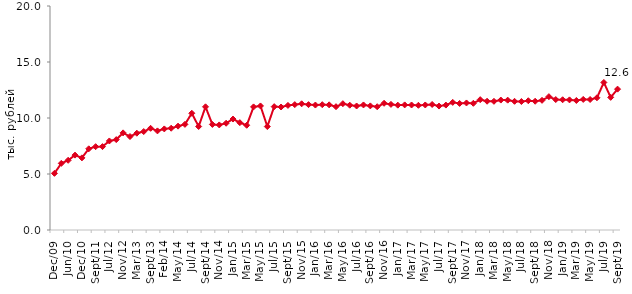
| Category | медианное значение среднедушевого располагаемого дохода, тыс. руб. |
|---|---|
| 2009-12-01 | 5.058 |
| 2010-04-01 | 5.949 |
| 2010-06-01 | 6.224 |
| 2010-09-01 | 6.686 |
| 2010-12-01 | 6.44 |
| 2011-07-01 | 7.25 |
| 2011-09-01 | 7.441 |
| 2011-12-01 | 7.446 |
| 2012-07-01 | 7.95 |
| 2012-09-01 | 8.071 |
| 2012-11-01 | 8.673 |
| 2012-12-01 | 8.345 |
| 2013-03-01 | 8.644 |
| 2013-06-01 | 8.789 |
| 2013-09-01 | 9.079 |
| 2013-12-01 | 8.849 |
| 2014-02-01 | 9.025 |
| 2014-04-01 | 9.087 |
| 2014-05-01 | 9.273 |
| 2014-06-01 | 9.432 |
| 2014-07-01 | 10.422 |
| 2014-08-01 | 9.241 |
| 2014-09-01 | 11 |
| 2014-10-01 | 9.426 |
| 2014-11-01 | 9.381 |
| 2014-12-01 | 9.532 |
| 2015-01-01 | 9.908 |
| 2015-02-01 | 9.585 |
| 2015-03-01 | 9.35 |
| 2015-04-01 | 10.991 |
| 2015-05-01 | 11.076 |
| 2015-06-01 | 9.237 |
| 2015-07-01 | 11.013 |
| 2015-08-01 | 10.981 |
| 2015-09-01 | 11.124 |
| 2015-10-01 | 11.195 |
| 2015-11-01 | 11.268 |
| 2015-12-01 | 11.194 |
| 2016-01-01 | 11.158 |
| 2016-02-01 | 11.188 |
| 2016-03-01 | 11.174 |
| 2016-04-01 | 11.01 |
| 2016-05-01 | 11.278 |
| 2016-06-01 | 11.142 |
| 2016-07-01 | 11.072 |
| 2016-08-01 | 11.165 |
| 2016-09-01 | 11.082 |
| 2016-10-01 | 11.008 |
| 2016-11-01 | 11.313 |
| 2016-12-01 | 11.216 |
| 2017-01-01 | 11.146 |
| 2017-02-01 | 11.17 |
| 2017-03-01 | 11.162 |
| 2017-04-01 | 11.133 |
| 2017-05-01 | 11.163 |
| 2017-06-01 | 11.207 |
| 2017-07-01 | 11.066 |
| 2017-08-01 | 11.153 |
| 2017-09-01 | 11.395 |
| 2017-10-01 | 11.301 |
| 2017-11-01 | 11.342 |
| 2017-12-01 | 11.31 |
| 2018-01-01 | 11.637 |
| 2018-02-01 | 11.497 |
| 2018-03-01 | 11.49 |
| 2018-04-01 | 11.601 |
| 2018-05-01 | 11.592 |
| 2018-06-01 | 11.491 |
| 2018-07-01 | 11.471 |
| 2018-08-01 | 11.541 |
| 2018-09-01 | 11.497 |
| 2018-10-01 | 11.578 |
| 2018-11-01 | 11.906 |
| 2018-12-01 | 11.648 |
| 2019-01-01 | 11.629 |
| 2019-02-01 | 11.617 |
| 2019-03-01 | 11.566 |
| 2019-04-01 | 11.659 |
| 2019-05-01 | 11.653 |
| 2019-06-01 | 11.805 |
| 2019-07-01 | 13.174 |
| 2019-08-01 | 11.844 |
| 2019-09-01 | 12.577 |